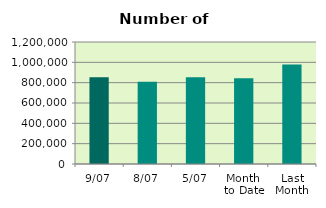
| Category | Series 0 |
|---|---|
| 9/07 | 852280 |
| 8/07 | 807854 |
| 5/07 | 853736 |
| Month 
to Date | 843290.286 |
| Last
Month | 977938.2 |